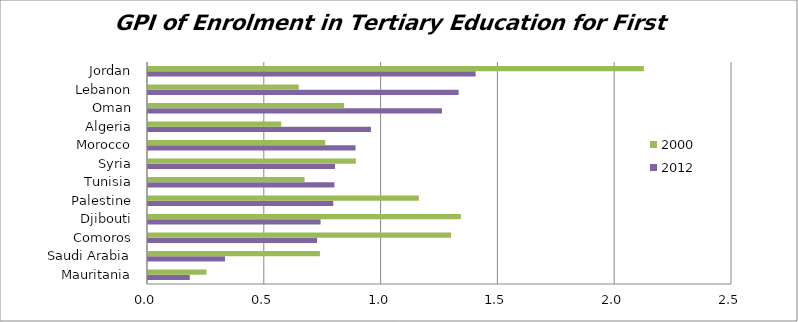
| Category | 2012 | 2000 |
|---|---|---|
| Mauritania | 0.179 | 0.25 |
| Saudi Arabia | 0.33 | 0.736 |
| Comoros | 0.724 | 1.297 |
| Djibouti | 0.739 | 1.339 |
| Palestine | 0.793 | 1.16 |
| Tunisia | 0.798 | 0.67 |
| Syria | 0.801 | 0.89 |
| Morocco | 0.888 | 0.758 |
| Algeria | 0.954 | 0.57 |
| Oman | 1.258 | 0.839 |
| Lebanon | 1.33 | 0.645 |
| Jordan | 1.403 | 2.123 |